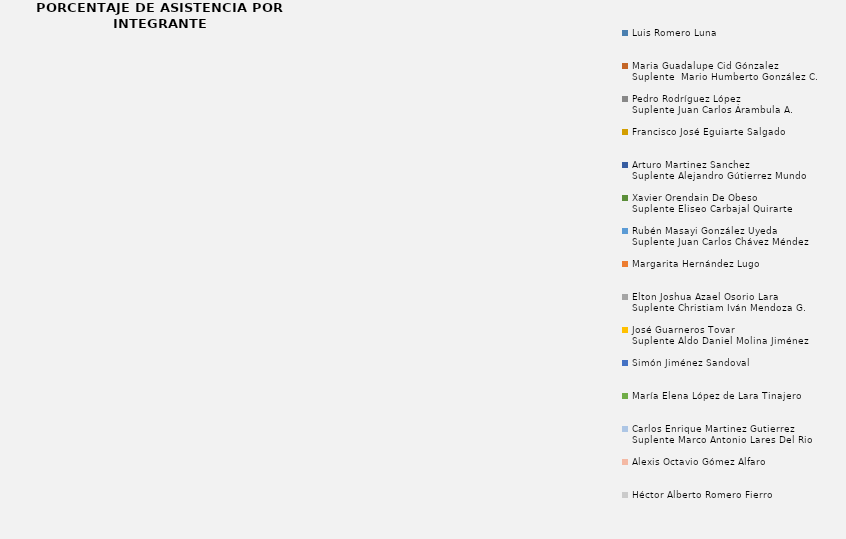
| Category | Series 0 |
|---|---|
| Luis Romero Luna | 0 |
| Maria Guadalupe Cid Gónzalez 
Suplente  Mario Humberto González C. | 0 |
| Pedro Rodríguez López                      
Suplente Juan Carlos Árambula A.  | 0 |
| Francisco José Eguiarte Salgado | 0 |
| Arturo Martinez Sanchez                     
Suplente Alejandro Gútierrez Mundo | 0 |
| Xavier Orendain De Obeso               
Suplente Eliseo Carbajal Quirarte | 0 |
| Rubén Masayi González Uyeda 
Suplente Juan Carlos Chávez Méndez | 0 |
| Margarita Hernández Lugo | 0 |
| Elton Joshua Azael Osorio Lara 
Suplente Christiam Iván Mendoza G. | 0 |
| José Guarneros Tovar                          
Suplente Aldo Daniel Molina Jiménez | 0 |
| Simón Jiménez Sandoval | 0 |
| María Elena López de Lara Tinajero | 0 |
| Carlos Enrique Martinez Gutierrez 
Suplente Marco Antonio Lares Del Rio | 0 |
| Alexis Octavio Gómez Alfaro | 0 |
| Héctor Alberto Romero Fierro | 0 |